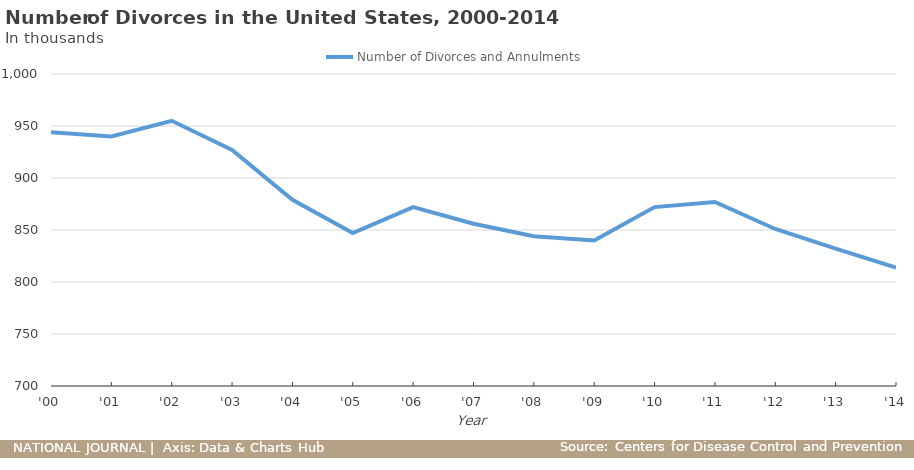
| Category | Number of Divorces and Annulments |
|---|---|
| 2014-12-31 | 813862 |
| 2013-12-31 | 832157 |
| 2012-12-31 | 851000 |
| 2011-12-31 | 877000 |
| 2010-12-31 | 872000 |
| 2009-12-31 | 840000 |
| 2008-12-31 | 844000 |
| 2007-12-31 | 856000 |
| 2006-12-31 | 872000 |
| 2005-12-31 | 847000 |
| 2004-12-31 | 879000 |
| 2003-12-31 | 927000 |
| 2002-12-31 | 955000 |
| 2001-12-31 | 940000 |
| 2000-12-31 | 944000 |